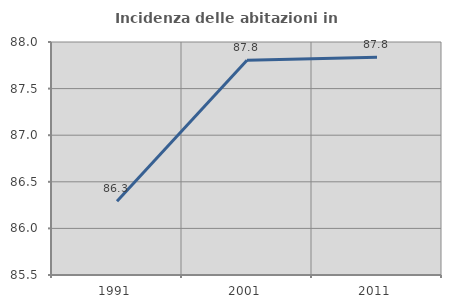
| Category | Incidenza delle abitazioni in proprietà  |
|---|---|
| 1991.0 | 86.29 |
| 2001.0 | 87.805 |
| 2011.0 | 87.835 |